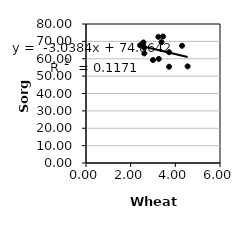
| Category | Series 0 |
|---|---|
| 2.42 | 67.744 |
| 2.57 | 69.396 |
| 3.72 | 63.779 |
| 3.72 | 55.428 |
| 2.61 | 63.077 |
| 3.0 | 59.256 |
| 3.24 | 72.616 |
| 3.26 | 59.912 |
| 3.45 | 72.805 |
| 4.55 | 55.614 |
| 4.3 | 67.471 |
| 3.38 | 69.546 |
| 2.6054916274 | 66.469 |